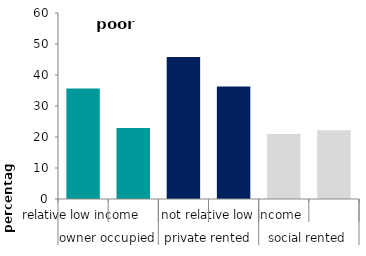
| Category | poor housing |
|---|---|
| 0 | 35.634 |
| 1 | 22.938 |
| 2 | 45.808 |
| 3 | 36.292 |
| 4 | 20.997 |
| 5 | 22.186 |